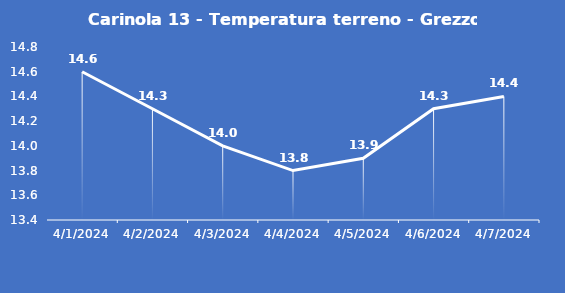
| Category | Carinola 13 - Temperatura terreno - Grezzo (°C) |
|---|---|
| 4/1/24 | 14.6 |
| 4/2/24 | 14.3 |
| 4/3/24 | 14 |
| 4/4/24 | 13.8 |
| 4/5/24 | 13.9 |
| 4/6/24 | 14.3 |
| 4/7/24 | 14.4 |